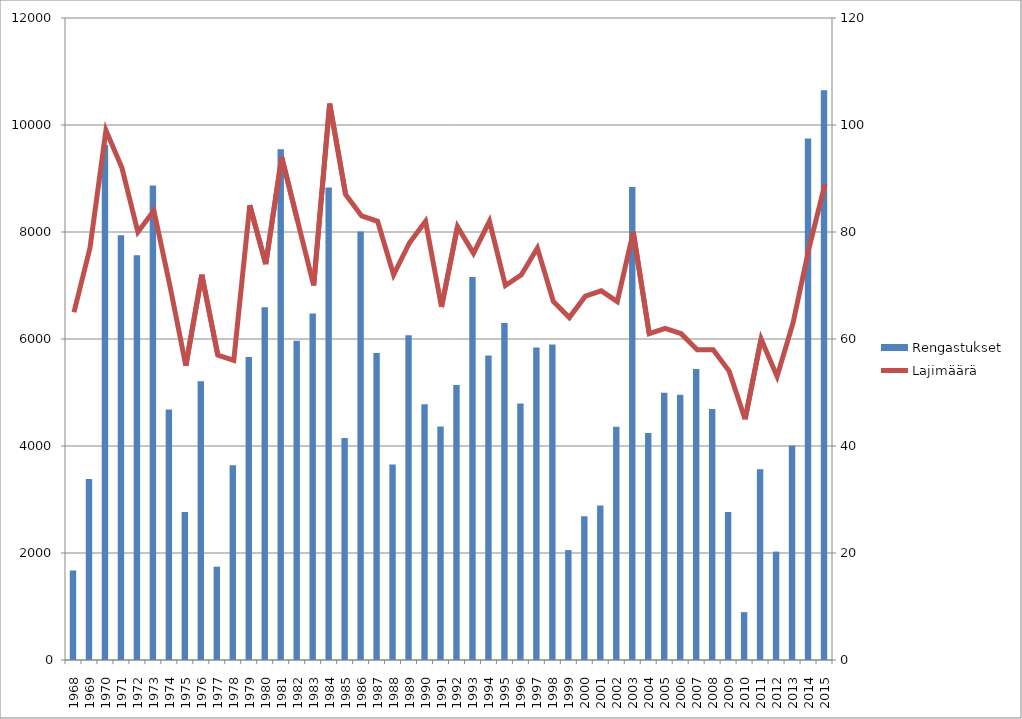
| Category | Rengastukset |
|---|---|
| 1968.0 | 1674 |
| 1969.0 | 3382 |
| 1970.0 | 9633 |
| 1971.0 | 7939 |
| 1972.0 | 7566 |
| 1973.0 | 8871 |
| 1974.0 | 4682 |
| 1975.0 | 2766 |
| 1976.0 | 5211 |
| 1977.0 | 1745 |
| 1978.0 | 3640 |
| 1979.0 | 5664 |
| 1980.0 | 6594 |
| 1981.0 | 9547 |
| 1982.0 | 5968 |
| 1983.0 | 6478 |
| 1984.0 | 8833 |
| 1985.0 | 4148 |
| 1986.0 | 8011 |
| 1987.0 | 5740 |
| 1988.0 | 3656 |
| 1989.0 | 6071 |
| 1990.0 | 4779 |
| 1991.0 | 4364 |
| 1992.0 | 5142 |
| 1993.0 | 7159 |
| 1994.0 | 5691 |
| 1995.0 | 6298 |
| 1996.0 | 4795 |
| 1997.0 | 5841 |
| 1998.0 | 5895 |
| 1999.0 | 2055 |
| 2000.0 | 2686 |
| 2001.0 | 2890 |
| 2002.0 | 4360 |
| 2003.0 | 8841 |
| 2004.0 | 4243 |
| 2005.0 | 4994 |
| 2006.0 | 4958 |
| 2007.0 | 5438 |
| 2008.0 | 4690 |
| 2009.0 | 2766 |
| 2010.0 | 895 |
| 2011.0 | 3564 |
| 2012.0 | 2026 |
| 2013.0 | 4009 |
| 2014.0 | 9750 |
| 2015.0 | 10648 |